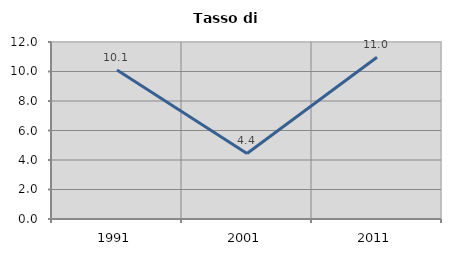
| Category | Tasso di disoccupazione   |
|---|---|
| 1991.0 | 10.101 |
| 2001.0 | 4.444 |
| 2011.0 | 10.965 |